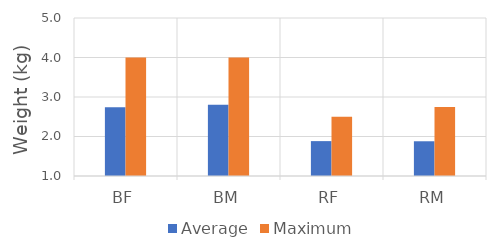
| Category | Average | Maximum |
|---|---|---|
| BF | 2.742 | 4 |
| BM | 2.801 | 4 |
| RF | 1.883 | 2.5 |
| RM | 1.879 | 2.75 |